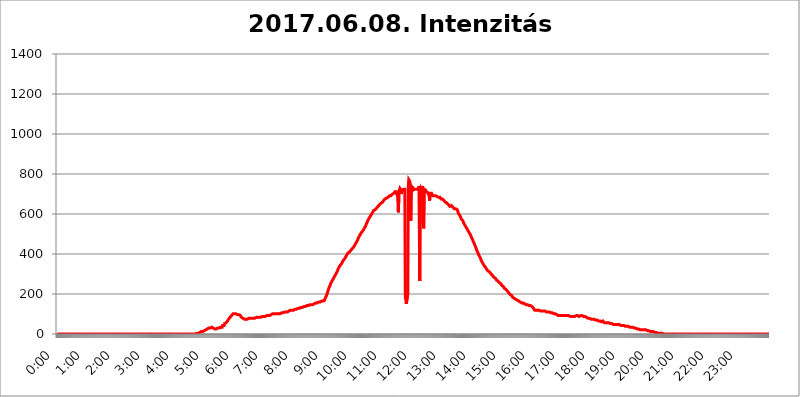
| Category | 2017.06.08. Intenzitás [W/m^2] |
|---|---|
| 0.0 | 0 |
| 0.0006944444444444445 | 0 |
| 0.001388888888888889 | 0 |
| 0.0020833333333333333 | 0 |
| 0.002777777777777778 | 0 |
| 0.003472222222222222 | 0 |
| 0.004166666666666667 | 0 |
| 0.004861111111111111 | 0 |
| 0.005555555555555556 | 0 |
| 0.0062499999999999995 | 0 |
| 0.006944444444444444 | 0 |
| 0.007638888888888889 | 0 |
| 0.008333333333333333 | 0 |
| 0.009027777777777779 | 0 |
| 0.009722222222222222 | 0 |
| 0.010416666666666666 | 0 |
| 0.011111111111111112 | 0 |
| 0.011805555555555555 | 0 |
| 0.012499999999999999 | 0 |
| 0.013194444444444444 | 0 |
| 0.013888888888888888 | 0 |
| 0.014583333333333332 | 0 |
| 0.015277777777777777 | 0 |
| 0.015972222222222224 | 0 |
| 0.016666666666666666 | 0 |
| 0.017361111111111112 | 0 |
| 0.018055555555555557 | 0 |
| 0.01875 | 0 |
| 0.019444444444444445 | 0 |
| 0.02013888888888889 | 0 |
| 0.020833333333333332 | 0 |
| 0.02152777777777778 | 0 |
| 0.022222222222222223 | 0 |
| 0.02291666666666667 | 0 |
| 0.02361111111111111 | 0 |
| 0.024305555555555556 | 0 |
| 0.024999999999999998 | 0 |
| 0.025694444444444447 | 0 |
| 0.02638888888888889 | 0 |
| 0.027083333333333334 | 0 |
| 0.027777777777777776 | 0 |
| 0.02847222222222222 | 0 |
| 0.029166666666666664 | 0 |
| 0.029861111111111113 | 0 |
| 0.030555555555555555 | 0 |
| 0.03125 | 0 |
| 0.03194444444444445 | 0 |
| 0.03263888888888889 | 0 |
| 0.03333333333333333 | 0 |
| 0.034027777777777775 | 0 |
| 0.034722222222222224 | 0 |
| 0.035416666666666666 | 0 |
| 0.036111111111111115 | 0 |
| 0.03680555555555556 | 0 |
| 0.0375 | 0 |
| 0.03819444444444444 | 0 |
| 0.03888888888888889 | 0 |
| 0.03958333333333333 | 0 |
| 0.04027777777777778 | 0 |
| 0.04097222222222222 | 0 |
| 0.041666666666666664 | 0 |
| 0.042361111111111106 | 0 |
| 0.04305555555555556 | 0 |
| 0.043750000000000004 | 0 |
| 0.044444444444444446 | 0 |
| 0.04513888888888889 | 0 |
| 0.04583333333333334 | 0 |
| 0.04652777777777778 | 0 |
| 0.04722222222222222 | 0 |
| 0.04791666666666666 | 0 |
| 0.04861111111111111 | 0 |
| 0.049305555555555554 | 0 |
| 0.049999999999999996 | 0 |
| 0.05069444444444445 | 0 |
| 0.051388888888888894 | 0 |
| 0.052083333333333336 | 0 |
| 0.05277777777777778 | 0 |
| 0.05347222222222222 | 0 |
| 0.05416666666666667 | 0 |
| 0.05486111111111111 | 0 |
| 0.05555555555555555 | 0 |
| 0.05625 | 0 |
| 0.05694444444444444 | 0 |
| 0.057638888888888885 | 0 |
| 0.05833333333333333 | 0 |
| 0.05902777777777778 | 0 |
| 0.059722222222222225 | 0 |
| 0.06041666666666667 | 0 |
| 0.061111111111111116 | 0 |
| 0.06180555555555556 | 0 |
| 0.0625 | 0 |
| 0.06319444444444444 | 0 |
| 0.06388888888888888 | 0 |
| 0.06458333333333334 | 0 |
| 0.06527777777777778 | 0 |
| 0.06597222222222222 | 0 |
| 0.06666666666666667 | 0 |
| 0.06736111111111111 | 0 |
| 0.06805555555555555 | 0 |
| 0.06874999999999999 | 0 |
| 0.06944444444444443 | 0 |
| 0.07013888888888889 | 0 |
| 0.07083333333333333 | 0 |
| 0.07152777777777779 | 0 |
| 0.07222222222222223 | 0 |
| 0.07291666666666667 | 0 |
| 0.07361111111111111 | 0 |
| 0.07430555555555556 | 0 |
| 0.075 | 0 |
| 0.07569444444444444 | 0 |
| 0.0763888888888889 | 0 |
| 0.07708333333333334 | 0 |
| 0.07777777777777778 | 0 |
| 0.07847222222222222 | 0 |
| 0.07916666666666666 | 0 |
| 0.0798611111111111 | 0 |
| 0.08055555555555556 | 0 |
| 0.08125 | 0 |
| 0.08194444444444444 | 0 |
| 0.08263888888888889 | 0 |
| 0.08333333333333333 | 0 |
| 0.08402777777777777 | 0 |
| 0.08472222222222221 | 0 |
| 0.08541666666666665 | 0 |
| 0.08611111111111112 | 0 |
| 0.08680555555555557 | 0 |
| 0.08750000000000001 | 0 |
| 0.08819444444444445 | 0 |
| 0.08888888888888889 | 0 |
| 0.08958333333333333 | 0 |
| 0.09027777777777778 | 0 |
| 0.09097222222222222 | 0 |
| 0.09166666666666667 | 0 |
| 0.09236111111111112 | 0 |
| 0.09305555555555556 | 0 |
| 0.09375 | 0 |
| 0.09444444444444444 | 0 |
| 0.09513888888888888 | 0 |
| 0.09583333333333333 | 0 |
| 0.09652777777777777 | 0 |
| 0.09722222222222222 | 0 |
| 0.09791666666666667 | 0 |
| 0.09861111111111111 | 0 |
| 0.09930555555555555 | 0 |
| 0.09999999999999999 | 0 |
| 0.10069444444444443 | 0 |
| 0.1013888888888889 | 0 |
| 0.10208333333333335 | 0 |
| 0.10277777777777779 | 0 |
| 0.10347222222222223 | 0 |
| 0.10416666666666667 | 0 |
| 0.10486111111111111 | 0 |
| 0.10555555555555556 | 0 |
| 0.10625 | 0 |
| 0.10694444444444444 | 0 |
| 0.1076388888888889 | 0 |
| 0.10833333333333334 | 0 |
| 0.10902777777777778 | 0 |
| 0.10972222222222222 | 0 |
| 0.1111111111111111 | 0 |
| 0.11180555555555556 | 0 |
| 0.11180555555555556 | 0 |
| 0.1125 | 0 |
| 0.11319444444444444 | 0 |
| 0.11388888888888889 | 0 |
| 0.11458333333333333 | 0 |
| 0.11527777777777777 | 0 |
| 0.11597222222222221 | 0 |
| 0.11666666666666665 | 0 |
| 0.1173611111111111 | 0 |
| 0.11805555555555557 | 0 |
| 0.11944444444444445 | 0 |
| 0.12013888888888889 | 0 |
| 0.12083333333333333 | 0 |
| 0.12152777777777778 | 0 |
| 0.12222222222222223 | 0 |
| 0.12291666666666667 | 0 |
| 0.12291666666666667 | 0 |
| 0.12361111111111112 | 0 |
| 0.12430555555555556 | 0 |
| 0.125 | 0 |
| 0.12569444444444444 | 0 |
| 0.12638888888888888 | 0 |
| 0.12708333333333333 | 0 |
| 0.16875 | 0 |
| 0.12847222222222224 | 0 |
| 0.12916666666666668 | 0 |
| 0.12986111111111112 | 0 |
| 0.13055555555555556 | 0 |
| 0.13125 | 0 |
| 0.13194444444444445 | 0 |
| 0.1326388888888889 | 0 |
| 0.13333333333333333 | 0 |
| 0.13402777777777777 | 0 |
| 0.13402777777777777 | 0 |
| 0.13472222222222222 | 0 |
| 0.13541666666666666 | 0 |
| 0.1361111111111111 | 0 |
| 0.13749999999999998 | 0 |
| 0.13819444444444443 | 0 |
| 0.1388888888888889 | 0 |
| 0.13958333333333334 | 0 |
| 0.14027777777777778 | 0 |
| 0.14097222222222222 | 0 |
| 0.14166666666666666 | 0 |
| 0.1423611111111111 | 0 |
| 0.14305555555555557 | 0 |
| 0.14375000000000002 | 0 |
| 0.14444444444444446 | 0 |
| 0.1451388888888889 | 0 |
| 0.1451388888888889 | 0 |
| 0.14652777777777778 | 0 |
| 0.14722222222222223 | 0 |
| 0.14791666666666667 | 0 |
| 0.1486111111111111 | 0 |
| 0.14930555555555555 | 0 |
| 0.15 | 0 |
| 0.15069444444444444 | 0 |
| 0.15138888888888888 | 0 |
| 0.15208333333333332 | 0 |
| 0.15277777777777776 | 0 |
| 0.15347222222222223 | 0 |
| 0.15416666666666667 | 0 |
| 0.15486111111111112 | 0 |
| 0.15555555555555556 | 0 |
| 0.15625 | 0 |
| 0.15694444444444444 | 0 |
| 0.15763888888888888 | 0 |
| 0.15833333333333333 | 0 |
| 0.15902777777777777 | 0 |
| 0.15972222222222224 | 0 |
| 0.16041666666666668 | 0 |
| 0.16111111111111112 | 0 |
| 0.16180555555555556 | 0 |
| 0.1625 | 0 |
| 0.16319444444444445 | 0 |
| 0.1638888888888889 | 0 |
| 0.16458333333333333 | 0 |
| 0.16527777777777777 | 0 |
| 0.16597222222222222 | 0 |
| 0.16666666666666666 | 0 |
| 0.1673611111111111 | 0 |
| 0.16805555555555554 | 0 |
| 0.16874999999999998 | 0 |
| 0.16944444444444443 | 0 |
| 0.17013888888888887 | 0 |
| 0.1708333333333333 | 0 |
| 0.17152777777777775 | 0 |
| 0.17222222222222225 | 0 |
| 0.1729166666666667 | 0 |
| 0.17361111111111113 | 0 |
| 0.17430555555555557 | 0 |
| 0.17500000000000002 | 0 |
| 0.17569444444444446 | 0 |
| 0.1763888888888889 | 0 |
| 0.17708333333333334 | 0 |
| 0.17777777777777778 | 0 |
| 0.17847222222222223 | 0 |
| 0.17916666666666667 | 0 |
| 0.1798611111111111 | 0 |
| 0.18055555555555555 | 0 |
| 0.18125 | 0 |
| 0.18194444444444444 | 0 |
| 0.1826388888888889 | 0 |
| 0.18333333333333335 | 0 |
| 0.1840277777777778 | 0 |
| 0.18472222222222223 | 0 |
| 0.18541666666666667 | 0 |
| 0.18611111111111112 | 0 |
| 0.18680555555555556 | 0 |
| 0.1875 | 0 |
| 0.18819444444444444 | 0 |
| 0.18888888888888888 | 0 |
| 0.18958333333333333 | 0 |
| 0.19027777777777777 | 0 |
| 0.1909722222222222 | 0 |
| 0.19166666666666665 | 0 |
| 0.19236111111111112 | 0 |
| 0.19305555555555554 | 0 |
| 0.19375 | 0 |
| 0.19444444444444445 | 3.525 |
| 0.1951388888888889 | 3.525 |
| 0.19583333333333333 | 3.525 |
| 0.19652777777777777 | 3.525 |
| 0.19722222222222222 | 3.525 |
| 0.19791666666666666 | 3.525 |
| 0.1986111111111111 | 7.887 |
| 0.19930555555555554 | 7.887 |
| 0.19999999999999998 | 7.887 |
| 0.20069444444444443 | 12.257 |
| 0.20138888888888887 | 12.257 |
| 0.2020833333333333 | 12.257 |
| 0.2027777777777778 | 12.257 |
| 0.2034722222222222 | 12.257 |
| 0.2041666666666667 | 12.257 |
| 0.20486111111111113 | 12.257 |
| 0.20555555555555557 | 12.257 |
| 0.20625000000000002 | 16.636 |
| 0.20694444444444446 | 16.636 |
| 0.2076388888888889 | 16.636 |
| 0.20833333333333334 | 21.024 |
| 0.20902777777777778 | 21.024 |
| 0.20972222222222223 | 25.419 |
| 0.21041666666666667 | 25.419 |
| 0.2111111111111111 | 25.419 |
| 0.21180555555555555 | 29.823 |
| 0.2125 | 29.823 |
| 0.21319444444444444 | 29.823 |
| 0.2138888888888889 | 29.823 |
| 0.21458333333333335 | 29.823 |
| 0.2152777777777778 | 29.823 |
| 0.21597222222222223 | 29.823 |
| 0.21666666666666667 | 34.234 |
| 0.21736111111111112 | 34.234 |
| 0.21805555555555556 | 34.234 |
| 0.21875 | 29.823 |
| 0.21944444444444444 | 29.823 |
| 0.22013888888888888 | 25.419 |
| 0.22083333333333333 | 25.419 |
| 0.22152777777777777 | 25.419 |
| 0.2222222222222222 | 25.419 |
| 0.22291666666666665 | 25.419 |
| 0.2236111111111111 | 25.419 |
| 0.22430555555555556 | 29.823 |
| 0.225 | 29.823 |
| 0.22569444444444445 | 29.823 |
| 0.2263888888888889 | 29.823 |
| 0.22708333333333333 | 29.823 |
| 0.22777777777777777 | 29.823 |
| 0.22847222222222222 | 29.823 |
| 0.22916666666666666 | 34.234 |
| 0.2298611111111111 | 38.653 |
| 0.23055555555555554 | 34.234 |
| 0.23124999999999998 | 34.234 |
| 0.23194444444444443 | 43.079 |
| 0.23263888888888887 | 47.511 |
| 0.2333333333333333 | 47.511 |
| 0.2340277777777778 | 43.079 |
| 0.2347222222222222 | 51.951 |
| 0.2354166666666667 | 56.398 |
| 0.23611111111111113 | 56.398 |
| 0.23680555555555557 | 56.398 |
| 0.23750000000000002 | 60.85 |
| 0.23819444444444446 | 60.85 |
| 0.2388888888888889 | 65.31 |
| 0.23958333333333334 | 69.775 |
| 0.24027777777777778 | 74.246 |
| 0.24097222222222223 | 74.246 |
| 0.24166666666666667 | 78.722 |
| 0.2423611111111111 | 83.205 |
| 0.24305555555555555 | 83.205 |
| 0.24375 | 87.692 |
| 0.24444444444444446 | 92.184 |
| 0.24513888888888888 | 92.184 |
| 0.24583333333333335 | 96.682 |
| 0.2465277777777778 | 101.184 |
| 0.24722222222222223 | 101.184 |
| 0.24791666666666667 | 101.184 |
| 0.24861111111111112 | 101.184 |
| 0.24930555555555556 | 101.184 |
| 0.25 | 105.69 |
| 0.25069444444444444 | 101.184 |
| 0.2513888888888889 | 101.184 |
| 0.2520833333333333 | 101.184 |
| 0.25277777777777777 | 96.682 |
| 0.2534722222222222 | 96.682 |
| 0.25416666666666665 | 96.682 |
| 0.2548611111111111 | 96.682 |
| 0.2555555555555556 | 96.682 |
| 0.25625000000000003 | 92.184 |
| 0.2569444444444445 | 92.184 |
| 0.2576388888888889 | 87.692 |
| 0.25833333333333336 | 83.205 |
| 0.2590277777777778 | 83.205 |
| 0.25972222222222224 | 83.205 |
| 0.2604166666666667 | 78.722 |
| 0.2611111111111111 | 78.722 |
| 0.26180555555555557 | 74.246 |
| 0.2625 | 74.246 |
| 0.26319444444444445 | 74.246 |
| 0.2638888888888889 | 74.246 |
| 0.26458333333333334 | 74.246 |
| 0.2652777777777778 | 74.246 |
| 0.2659722222222222 | 74.246 |
| 0.26666666666666666 | 74.246 |
| 0.2673611111111111 | 74.246 |
| 0.26805555555555555 | 74.246 |
| 0.26875 | 78.722 |
| 0.26944444444444443 | 74.246 |
| 0.2701388888888889 | 74.246 |
| 0.2708333333333333 | 78.722 |
| 0.27152777777777776 | 78.722 |
| 0.2722222222222222 | 78.722 |
| 0.27291666666666664 | 78.722 |
| 0.2736111111111111 | 78.722 |
| 0.2743055555555555 | 78.722 |
| 0.27499999999999997 | 78.722 |
| 0.27569444444444446 | 78.722 |
| 0.27638888888888885 | 83.205 |
| 0.27708333333333335 | 78.722 |
| 0.2777777777777778 | 83.205 |
| 0.27847222222222223 | 83.205 |
| 0.2791666666666667 | 83.205 |
| 0.2798611111111111 | 83.205 |
| 0.28055555555555556 | 83.205 |
| 0.28125 | 83.205 |
| 0.28194444444444444 | 83.205 |
| 0.2826388888888889 | 83.205 |
| 0.2833333333333333 | 83.205 |
| 0.28402777777777777 | 83.205 |
| 0.2847222222222222 | 83.205 |
| 0.28541666666666665 | 83.205 |
| 0.28611111111111115 | 87.692 |
| 0.28680555555555554 | 87.692 |
| 0.28750000000000003 | 87.692 |
| 0.2881944444444445 | 87.692 |
| 0.2888888888888889 | 87.692 |
| 0.28958333333333336 | 87.692 |
| 0.2902777777777778 | 87.692 |
| 0.29097222222222224 | 87.692 |
| 0.2916666666666667 | 87.692 |
| 0.2923611111111111 | 92.184 |
| 0.29305555555555557 | 92.184 |
| 0.29375 | 92.184 |
| 0.29444444444444445 | 92.184 |
| 0.2951388888888889 | 92.184 |
| 0.29583333333333334 | 92.184 |
| 0.2965277777777778 | 92.184 |
| 0.2972222222222222 | 92.184 |
| 0.29791666666666666 | 92.184 |
| 0.2986111111111111 | 96.682 |
| 0.29930555555555555 | 96.682 |
| 0.3 | 96.682 |
| 0.30069444444444443 | 96.682 |
| 0.3013888888888889 | 96.682 |
| 0.3020833333333333 | 101.184 |
| 0.30277777777777776 | 101.184 |
| 0.3034722222222222 | 101.184 |
| 0.30416666666666664 | 101.184 |
| 0.3048611111111111 | 101.184 |
| 0.3055555555555555 | 101.184 |
| 0.30624999999999997 | 101.184 |
| 0.3069444444444444 | 101.184 |
| 0.3076388888888889 | 101.184 |
| 0.30833333333333335 | 101.184 |
| 0.3090277777777778 | 101.184 |
| 0.30972222222222223 | 101.184 |
| 0.3104166666666667 | 101.184 |
| 0.3111111111111111 | 101.184 |
| 0.31180555555555556 | 101.184 |
| 0.3125 | 101.184 |
| 0.31319444444444444 | 105.69 |
| 0.3138888888888889 | 101.184 |
| 0.3145833333333333 | 105.69 |
| 0.31527777777777777 | 105.69 |
| 0.3159722222222222 | 105.69 |
| 0.31666666666666665 | 105.69 |
| 0.31736111111111115 | 110.201 |
| 0.31805555555555554 | 105.69 |
| 0.31875000000000003 | 110.201 |
| 0.3194444444444445 | 110.201 |
| 0.3201388888888889 | 110.201 |
| 0.32083333333333336 | 110.201 |
| 0.3215277777777778 | 110.201 |
| 0.32222222222222224 | 110.201 |
| 0.3229166666666667 | 110.201 |
| 0.3236111111111111 | 114.716 |
| 0.32430555555555557 | 114.716 |
| 0.325 | 114.716 |
| 0.32569444444444445 | 114.716 |
| 0.3263888888888889 | 114.716 |
| 0.32708333333333334 | 119.235 |
| 0.3277777777777778 | 114.716 |
| 0.3284722222222222 | 119.235 |
| 0.32916666666666666 | 119.235 |
| 0.3298611111111111 | 119.235 |
| 0.33055555555555555 | 119.235 |
| 0.33125 | 119.235 |
| 0.33194444444444443 | 119.235 |
| 0.3326388888888889 | 119.235 |
| 0.3333333333333333 | 123.758 |
| 0.3340277777777778 | 123.758 |
| 0.3347222222222222 | 123.758 |
| 0.3354166666666667 | 123.758 |
| 0.3361111111111111 | 128.284 |
| 0.3368055555555556 | 128.284 |
| 0.33749999999999997 | 128.284 |
| 0.33819444444444446 | 128.284 |
| 0.33888888888888885 | 128.284 |
| 0.33958333333333335 | 128.284 |
| 0.34027777777777773 | 128.284 |
| 0.34097222222222223 | 132.814 |
| 0.3416666666666666 | 132.814 |
| 0.3423611111111111 | 132.814 |
| 0.3430555555555555 | 132.814 |
| 0.34375 | 132.814 |
| 0.3444444444444445 | 137.347 |
| 0.3451388888888889 | 137.347 |
| 0.3458333333333334 | 137.347 |
| 0.34652777777777777 | 137.347 |
| 0.34722222222222227 | 137.347 |
| 0.34791666666666665 | 137.347 |
| 0.34861111111111115 | 137.347 |
| 0.34930555555555554 | 137.347 |
| 0.35000000000000003 | 141.884 |
| 0.3506944444444444 | 141.884 |
| 0.3513888888888889 | 141.884 |
| 0.3520833333333333 | 141.884 |
| 0.3527777777777778 | 141.884 |
| 0.3534722222222222 | 146.423 |
| 0.3541666666666667 | 146.423 |
| 0.3548611111111111 | 146.423 |
| 0.35555555555555557 | 146.423 |
| 0.35625 | 146.423 |
| 0.35694444444444445 | 146.423 |
| 0.3576388888888889 | 146.423 |
| 0.35833333333333334 | 146.423 |
| 0.3590277777777778 | 150.964 |
| 0.3597222222222222 | 150.964 |
| 0.36041666666666666 | 150.964 |
| 0.3611111111111111 | 150.964 |
| 0.36180555555555555 | 150.964 |
| 0.3625 | 155.509 |
| 0.36319444444444443 | 155.509 |
| 0.3638888888888889 | 155.509 |
| 0.3645833333333333 | 155.509 |
| 0.3652777777777778 | 155.509 |
| 0.3659722222222222 | 160.056 |
| 0.3666666666666667 | 160.056 |
| 0.3673611111111111 | 160.056 |
| 0.3680555555555556 | 160.056 |
| 0.36874999999999997 | 160.056 |
| 0.36944444444444446 | 164.605 |
| 0.37013888888888885 | 164.605 |
| 0.37083333333333335 | 164.605 |
| 0.37152777777777773 | 164.605 |
| 0.37222222222222223 | 164.605 |
| 0.3729166666666666 | 164.605 |
| 0.3736111111111111 | 164.605 |
| 0.3743055555555555 | 164.605 |
| 0.375 | 169.156 |
| 0.3756944444444445 | 178.264 |
| 0.3763888888888889 | 182.82 |
| 0.3770833333333334 | 187.378 |
| 0.37777777777777777 | 191.937 |
| 0.37847222222222227 | 201.058 |
| 0.37916666666666665 | 210.182 |
| 0.37986111111111115 | 214.746 |
| 0.38055555555555554 | 223.873 |
| 0.38125000000000003 | 233 |
| 0.3819444444444444 | 237.564 |
| 0.3826388888888889 | 242.127 |
| 0.3833333333333333 | 251.251 |
| 0.3840277777777778 | 255.813 |
| 0.3847222222222222 | 260.373 |
| 0.3854166666666667 | 264.932 |
| 0.3861111111111111 | 269.49 |
| 0.38680555555555557 | 274.047 |
| 0.3875 | 278.603 |
| 0.38819444444444445 | 283.156 |
| 0.3888888888888889 | 287.709 |
| 0.38958333333333334 | 292.259 |
| 0.3902777777777778 | 296.808 |
| 0.3909722222222222 | 296.808 |
| 0.39166666666666666 | 305.898 |
| 0.3923611111111111 | 310.44 |
| 0.39305555555555555 | 314.98 |
| 0.39375 | 324.052 |
| 0.39444444444444443 | 328.584 |
| 0.3951388888888889 | 333.113 |
| 0.3958333333333333 | 337.639 |
| 0.3965277777777778 | 342.162 |
| 0.3972222222222222 | 346.682 |
| 0.3979166666666667 | 346.682 |
| 0.3986111111111111 | 351.198 |
| 0.3993055555555556 | 355.712 |
| 0.39999999999999997 | 360.221 |
| 0.40069444444444446 | 360.221 |
| 0.40138888888888885 | 369.23 |
| 0.40208333333333335 | 369.23 |
| 0.40277777777777773 | 373.729 |
| 0.40347222222222223 | 378.224 |
| 0.4041666666666666 | 382.715 |
| 0.4048611111111111 | 387.202 |
| 0.4055555555555555 | 391.685 |
| 0.40625 | 396.164 |
| 0.4069444444444445 | 400.638 |
| 0.4076388888888889 | 405.108 |
| 0.4083333333333334 | 405.108 |
| 0.40902777777777777 | 409.574 |
| 0.40972222222222227 | 409.574 |
| 0.41041666666666665 | 414.035 |
| 0.41111111111111115 | 414.035 |
| 0.41180555555555554 | 418.492 |
| 0.41250000000000003 | 418.492 |
| 0.4131944444444444 | 422.943 |
| 0.4138888888888889 | 427.39 |
| 0.4145833333333333 | 427.39 |
| 0.4152777777777778 | 431.833 |
| 0.4159722222222222 | 436.27 |
| 0.4166666666666667 | 440.702 |
| 0.4173611111111111 | 445.129 |
| 0.41805555555555557 | 449.551 |
| 0.41875 | 453.968 |
| 0.41944444444444445 | 458.38 |
| 0.4201388888888889 | 462.786 |
| 0.42083333333333334 | 467.187 |
| 0.4215277777777778 | 471.582 |
| 0.4222222222222222 | 480.356 |
| 0.42291666666666666 | 484.735 |
| 0.4236111111111111 | 489.108 |
| 0.42430555555555555 | 493.475 |
| 0.425 | 497.836 |
| 0.42569444444444443 | 502.192 |
| 0.4263888888888889 | 506.542 |
| 0.4270833333333333 | 510.885 |
| 0.4277777777777778 | 510.885 |
| 0.4284722222222222 | 515.223 |
| 0.4291666666666667 | 515.223 |
| 0.4298611111111111 | 523.88 |
| 0.4305555555555556 | 528.2 |
| 0.43124999999999997 | 532.513 |
| 0.43194444444444446 | 536.82 |
| 0.43263888888888885 | 541.121 |
| 0.43333333333333335 | 549.704 |
| 0.43402777777777773 | 553.986 |
| 0.43472222222222223 | 558.261 |
| 0.4354166666666666 | 566.793 |
| 0.4361111111111111 | 571.049 |
| 0.4368055555555555 | 575.299 |
| 0.4375 | 579.542 |
| 0.4381944444444445 | 583.779 |
| 0.4388888888888889 | 588.009 |
| 0.4395833333333334 | 592.233 |
| 0.44027777777777777 | 596.45 |
| 0.44097222222222227 | 600.661 |
| 0.44166666666666665 | 604.864 |
| 0.44236111111111115 | 609.062 |
| 0.44305555555555554 | 613.252 |
| 0.44375000000000003 | 617.436 |
| 0.4444444444444444 | 617.436 |
| 0.4451388888888889 | 621.613 |
| 0.4458333333333333 | 621.613 |
| 0.4465277777777778 | 625.784 |
| 0.4472222222222222 | 625.784 |
| 0.4479166666666667 | 629.948 |
| 0.4486111111111111 | 634.105 |
| 0.44930555555555557 | 634.105 |
| 0.45 | 638.256 |
| 0.45069444444444445 | 638.256 |
| 0.4513888888888889 | 642.4 |
| 0.45208333333333334 | 646.537 |
| 0.4527777777777778 | 650.667 |
| 0.4534722222222222 | 650.667 |
| 0.45416666666666666 | 654.791 |
| 0.4548611111111111 | 658.909 |
| 0.45555555555555555 | 658.909 |
| 0.45625 | 658.909 |
| 0.45694444444444443 | 663.019 |
| 0.4576388888888889 | 667.123 |
| 0.4583333333333333 | 667.123 |
| 0.4590277777777778 | 671.22 |
| 0.4597222222222222 | 675.311 |
| 0.4604166666666667 | 675.311 |
| 0.4611111111111111 | 675.311 |
| 0.4618055555555556 | 679.395 |
| 0.46249999999999997 | 679.395 |
| 0.46319444444444446 | 679.395 |
| 0.46388888888888885 | 683.473 |
| 0.46458333333333335 | 683.473 |
| 0.46527777777777773 | 687.544 |
| 0.46597222222222223 | 691.608 |
| 0.4666666666666666 | 691.608 |
| 0.4673611111111111 | 691.608 |
| 0.4680555555555555 | 691.608 |
| 0.46875 | 695.666 |
| 0.4694444444444445 | 695.666 |
| 0.4701388888888889 | 699.717 |
| 0.4708333333333334 | 703.762 |
| 0.47152777777777777 | 703.762 |
| 0.47222222222222227 | 703.762 |
| 0.47291666666666665 | 707.8 |
| 0.47361111111111115 | 711.832 |
| 0.47430555555555554 | 711.832 |
| 0.47500000000000003 | 711.832 |
| 0.4756944444444444 | 711.832 |
| 0.4763888888888889 | 707.8 |
| 0.4770833333333333 | 687.544 |
| 0.4777777777777778 | 703.762 |
| 0.4784722222222222 | 609.062 |
| 0.4791666666666667 | 703.762 |
| 0.4798611111111111 | 719.877 |
| 0.48055555555555557 | 727.896 |
| 0.48125 | 723.889 |
| 0.48194444444444445 | 719.877 |
| 0.4826388888888889 | 699.717 |
| 0.48333333333333334 | 719.877 |
| 0.4840277777777778 | 719.877 |
| 0.4847222222222222 | 719.877 |
| 0.48541666666666666 | 723.889 |
| 0.4861111111111111 | 723.889 |
| 0.48680555555555555 | 723.889 |
| 0.4875 | 723.889 |
| 0.48819444444444443 | 178.264 |
| 0.4888888888888889 | 196.497 |
| 0.4895833333333333 | 150.964 |
| 0.4902777777777778 | 150.964 |
| 0.4909722222222222 | 155.509 |
| 0.4916666666666667 | 205.62 |
| 0.4923611111111111 | 739.877 |
| 0.4930555555555556 | 771.559 |
| 0.49374999999999997 | 767.62 |
| 0.49444444444444446 | 763.674 |
| 0.49513888888888885 | 747.834 |
| 0.49583333333333335 | 566.793 |
| 0.49652777777777773 | 739.877 |
| 0.49722222222222223 | 743.859 |
| 0.4979166666666666 | 739.877 |
| 0.4986111111111111 | 731.896 |
| 0.4993055555555555 | 719.877 |
| 0.5 | 719.877 |
| 0.5006944444444444 | 719.877 |
| 0.5013888888888889 | 723.889 |
| 0.5020833333333333 | 723.889 |
| 0.5027777777777778 | 723.889 |
| 0.5034722222222222 | 723.889 |
| 0.5041666666666667 | 719.877 |
| 0.5048611111111111 | 719.877 |
| 0.5055555555555555 | 723.889 |
| 0.50625 | 727.896 |
| 0.5069444444444444 | 731.896 |
| 0.5076388888888889 | 739.877 |
| 0.5083333333333333 | 264.932 |
| 0.5090277777777777 | 719.877 |
| 0.5097222222222222 | 727.896 |
| 0.5104166666666666 | 719.877 |
| 0.5111111111111112 | 719.877 |
| 0.5118055555555555 | 731.896 |
| 0.5125000000000001 | 739.877 |
| 0.5131944444444444 | 553.986 |
| 0.513888888888889 | 528.2 |
| 0.5145833333333333 | 723.889 |
| 0.5152777777777778 | 727.896 |
| 0.5159722222222222 | 723.889 |
| 0.5166666666666667 | 719.877 |
| 0.517361111111111 | 711.832 |
| 0.5180555555555556 | 711.832 |
| 0.5187499999999999 | 707.8 |
| 0.5194444444444445 | 707.8 |
| 0.5201388888888888 | 703.762 |
| 0.5208333333333334 | 703.762 |
| 0.5215277777777778 | 691.608 |
| 0.5222222222222223 | 667.123 |
| 0.5229166666666667 | 703.762 |
| 0.5236111111111111 | 703.762 |
| 0.5243055555555556 | 703.762 |
| 0.525 | 703.762 |
| 0.5256944444444445 | 703.762 |
| 0.5263888888888889 | 691.608 |
| 0.5270833333333333 | 691.608 |
| 0.5277777777777778 | 691.608 |
| 0.5284722222222222 | 691.608 |
| 0.5291666666666667 | 687.544 |
| 0.5298611111111111 | 687.544 |
| 0.5305555555555556 | 691.608 |
| 0.53125 | 691.608 |
| 0.5319444444444444 | 687.544 |
| 0.5326388888888889 | 687.544 |
| 0.5333333333333333 | 687.544 |
| 0.5340277777777778 | 687.544 |
| 0.5347222222222222 | 683.473 |
| 0.5354166666666667 | 683.473 |
| 0.5361111111111111 | 683.473 |
| 0.5368055555555555 | 683.473 |
| 0.5375 | 679.395 |
| 0.5381944444444444 | 675.311 |
| 0.5388888888888889 | 675.311 |
| 0.5395833333333333 | 675.311 |
| 0.5402777777777777 | 675.311 |
| 0.5409722222222222 | 671.22 |
| 0.5416666666666666 | 671.22 |
| 0.5423611111111112 | 667.123 |
| 0.5430555555555555 | 667.123 |
| 0.5437500000000001 | 667.123 |
| 0.5444444444444444 | 658.909 |
| 0.545138888888889 | 658.909 |
| 0.5458333333333333 | 654.791 |
| 0.5465277777777778 | 654.791 |
| 0.5472222222222222 | 650.667 |
| 0.5479166666666667 | 650.667 |
| 0.548611111111111 | 646.537 |
| 0.5493055555555556 | 642.4 |
| 0.5499999999999999 | 642.4 |
| 0.5506944444444445 | 638.256 |
| 0.5513888888888888 | 638.256 |
| 0.5520833333333334 | 642.4 |
| 0.5527777777777778 | 642.4 |
| 0.5534722222222223 | 642.4 |
| 0.5541666666666667 | 638.256 |
| 0.5548611111111111 | 634.105 |
| 0.5555555555555556 | 634.105 |
| 0.55625 | 629.948 |
| 0.5569444444444445 | 625.784 |
| 0.5576388888888889 | 625.784 |
| 0.5583333333333333 | 625.784 |
| 0.5590277777777778 | 625.784 |
| 0.5597222222222222 | 625.784 |
| 0.5604166666666667 | 625.784 |
| 0.5611111111111111 | 621.613 |
| 0.5618055555555556 | 617.436 |
| 0.5625 | 604.864 |
| 0.5631944444444444 | 600.661 |
| 0.5638888888888889 | 596.45 |
| 0.5645833333333333 | 592.233 |
| 0.5652777777777778 | 588.009 |
| 0.5659722222222222 | 583.779 |
| 0.5666666666666667 | 575.299 |
| 0.5673611111111111 | 575.299 |
| 0.5680555555555555 | 571.049 |
| 0.56875 | 566.793 |
| 0.5694444444444444 | 562.53 |
| 0.5701388888888889 | 553.986 |
| 0.5708333333333333 | 549.704 |
| 0.5715277777777777 | 549.704 |
| 0.5722222222222222 | 541.121 |
| 0.5729166666666666 | 536.82 |
| 0.5736111111111112 | 532.513 |
| 0.5743055555555555 | 532.513 |
| 0.5750000000000001 | 523.88 |
| 0.5756944444444444 | 519.555 |
| 0.576388888888889 | 519.555 |
| 0.5770833333333333 | 510.885 |
| 0.5777777777777778 | 506.542 |
| 0.5784722222222222 | 502.192 |
| 0.5791666666666667 | 497.836 |
| 0.579861111111111 | 493.475 |
| 0.5805555555555556 | 489.108 |
| 0.5812499999999999 | 480.356 |
| 0.5819444444444445 | 475.972 |
| 0.5826388888888888 | 471.582 |
| 0.5833333333333334 | 462.786 |
| 0.5840277777777778 | 458.38 |
| 0.5847222222222223 | 453.968 |
| 0.5854166666666667 | 445.129 |
| 0.5861111111111111 | 440.702 |
| 0.5868055555555556 | 436.27 |
| 0.5875 | 427.39 |
| 0.5881944444444445 | 422.943 |
| 0.5888888888888889 | 414.035 |
| 0.5895833333333333 | 409.574 |
| 0.5902777777777778 | 405.108 |
| 0.5909722222222222 | 396.164 |
| 0.5916666666666667 | 391.685 |
| 0.5923611111111111 | 387.202 |
| 0.5930555555555556 | 382.715 |
| 0.59375 | 378.224 |
| 0.5944444444444444 | 369.23 |
| 0.5951388888888889 | 364.728 |
| 0.5958333333333333 | 360.221 |
| 0.5965277777777778 | 355.712 |
| 0.5972222222222222 | 351.198 |
| 0.5979166666666667 | 351.198 |
| 0.5986111111111111 | 342.162 |
| 0.5993055555555555 | 342.162 |
| 0.6 | 337.639 |
| 0.6006944444444444 | 333.113 |
| 0.6013888888888889 | 328.584 |
| 0.6020833333333333 | 324.052 |
| 0.6027777777777777 | 319.517 |
| 0.6034722222222222 | 319.517 |
| 0.6041666666666666 | 314.98 |
| 0.6048611111111112 | 314.98 |
| 0.6055555555555555 | 310.44 |
| 0.6062500000000001 | 310.44 |
| 0.6069444444444444 | 305.898 |
| 0.607638888888889 | 305.898 |
| 0.6083333333333333 | 301.354 |
| 0.6090277777777778 | 301.354 |
| 0.6097222222222222 | 296.808 |
| 0.6104166666666667 | 292.259 |
| 0.611111111111111 | 292.259 |
| 0.6118055555555556 | 287.709 |
| 0.6124999999999999 | 283.156 |
| 0.6131944444444445 | 283.156 |
| 0.6138888888888888 | 278.603 |
| 0.6145833333333334 | 278.603 |
| 0.6152777777777778 | 274.047 |
| 0.6159722222222223 | 269.49 |
| 0.6166666666666667 | 269.49 |
| 0.6173611111111111 | 264.932 |
| 0.6180555555555556 | 264.932 |
| 0.61875 | 260.373 |
| 0.6194444444444445 | 260.373 |
| 0.6201388888888889 | 255.813 |
| 0.6208333333333333 | 255.813 |
| 0.6215277777777778 | 251.251 |
| 0.6222222222222222 | 251.251 |
| 0.6229166666666667 | 246.689 |
| 0.6236111111111111 | 242.127 |
| 0.6243055555555556 | 242.127 |
| 0.625 | 237.564 |
| 0.6256944444444444 | 237.564 |
| 0.6263888888888889 | 233 |
| 0.6270833333333333 | 228.436 |
| 0.6277777777777778 | 228.436 |
| 0.6284722222222222 | 223.873 |
| 0.6291666666666667 | 223.873 |
| 0.6298611111111111 | 219.309 |
| 0.6305555555555555 | 219.309 |
| 0.63125 | 214.746 |
| 0.6319444444444444 | 210.182 |
| 0.6326388888888889 | 210.182 |
| 0.6333333333333333 | 205.62 |
| 0.6340277777777777 | 201.058 |
| 0.6347222222222222 | 201.058 |
| 0.6354166666666666 | 196.497 |
| 0.6361111111111112 | 196.497 |
| 0.6368055555555555 | 191.937 |
| 0.6375000000000001 | 191.937 |
| 0.6381944444444444 | 187.378 |
| 0.638888888888889 | 182.82 |
| 0.6395833333333333 | 182.82 |
| 0.6402777777777778 | 178.264 |
| 0.6409722222222222 | 178.264 |
| 0.6416666666666667 | 173.709 |
| 0.642361111111111 | 173.709 |
| 0.6430555555555556 | 173.709 |
| 0.6437499999999999 | 173.709 |
| 0.6444444444444445 | 169.156 |
| 0.6451388888888888 | 169.156 |
| 0.6458333333333334 | 164.605 |
| 0.6465277777777778 | 164.605 |
| 0.6472222222222223 | 164.605 |
| 0.6479166666666667 | 160.056 |
| 0.6486111111111111 | 160.056 |
| 0.6493055555555556 | 160.056 |
| 0.65 | 160.056 |
| 0.6506944444444445 | 160.056 |
| 0.6513888888888889 | 155.509 |
| 0.6520833333333333 | 155.509 |
| 0.6527777777777778 | 155.509 |
| 0.6534722222222222 | 155.509 |
| 0.6541666666666667 | 155.509 |
| 0.6548611111111111 | 155.509 |
| 0.6555555555555556 | 150.964 |
| 0.65625 | 150.964 |
| 0.6569444444444444 | 150.964 |
| 0.6576388888888889 | 146.423 |
| 0.6583333333333333 | 146.423 |
| 0.6590277777777778 | 146.423 |
| 0.6597222222222222 | 146.423 |
| 0.6604166666666667 | 146.423 |
| 0.6611111111111111 | 141.884 |
| 0.6618055555555555 | 141.884 |
| 0.6625 | 141.884 |
| 0.6631944444444444 | 141.884 |
| 0.6638888888888889 | 141.884 |
| 0.6645833333333333 | 141.884 |
| 0.6652777777777777 | 141.884 |
| 0.6659722222222222 | 137.347 |
| 0.6666666666666666 | 137.347 |
| 0.6673611111111111 | 132.814 |
| 0.6680555555555556 | 128.284 |
| 0.6687500000000001 | 123.758 |
| 0.6694444444444444 | 119.235 |
| 0.6701388888888888 | 119.235 |
| 0.6708333333333334 | 119.235 |
| 0.6715277777777778 | 119.235 |
| 0.6722222222222222 | 119.235 |
| 0.6729166666666666 | 119.235 |
| 0.6736111111111112 | 119.235 |
| 0.6743055555555556 | 119.235 |
| 0.6749999999999999 | 119.235 |
| 0.6756944444444444 | 119.235 |
| 0.6763888888888889 | 114.716 |
| 0.6770833333333334 | 114.716 |
| 0.6777777777777777 | 114.716 |
| 0.6784722222222223 | 114.716 |
| 0.6791666666666667 | 114.716 |
| 0.6798611111111111 | 114.716 |
| 0.6805555555555555 | 114.716 |
| 0.68125 | 114.716 |
| 0.6819444444444445 | 114.716 |
| 0.6826388888888889 | 110.201 |
| 0.6833333333333332 | 110.201 |
| 0.6840277777777778 | 114.716 |
| 0.6847222222222222 | 114.716 |
| 0.6854166666666667 | 110.201 |
| 0.686111111111111 | 110.201 |
| 0.6868055555555556 | 110.201 |
| 0.6875 | 110.201 |
| 0.6881944444444444 | 110.201 |
| 0.688888888888889 | 110.201 |
| 0.6895833333333333 | 110.201 |
| 0.6902777777777778 | 110.201 |
| 0.6909722222222222 | 110.201 |
| 0.6916666666666668 | 110.201 |
| 0.6923611111111111 | 105.69 |
| 0.6930555555555555 | 105.69 |
| 0.69375 | 105.69 |
| 0.6944444444444445 | 105.69 |
| 0.6951388888888889 | 105.69 |
| 0.6958333333333333 | 105.69 |
| 0.6965277777777777 | 101.184 |
| 0.6972222222222223 | 101.184 |
| 0.6979166666666666 | 101.184 |
| 0.6986111111111111 | 101.184 |
| 0.6993055555555556 | 101.184 |
| 0.7000000000000001 | 96.682 |
| 0.7006944444444444 | 96.682 |
| 0.7013888888888888 | 96.682 |
| 0.7020833333333334 | 92.184 |
| 0.7027777777777778 | 92.184 |
| 0.7034722222222222 | 92.184 |
| 0.7041666666666666 | 92.184 |
| 0.7048611111111112 | 92.184 |
| 0.7055555555555556 | 92.184 |
| 0.7062499999999999 | 92.184 |
| 0.7069444444444444 | 92.184 |
| 0.7076388888888889 | 92.184 |
| 0.7083333333333334 | 92.184 |
| 0.7090277777777777 | 92.184 |
| 0.7097222222222223 | 92.184 |
| 0.7104166666666667 | 92.184 |
| 0.7111111111111111 | 92.184 |
| 0.7118055555555555 | 92.184 |
| 0.7125 | 92.184 |
| 0.7131944444444445 | 92.184 |
| 0.7138888888888889 | 92.184 |
| 0.7145833333333332 | 92.184 |
| 0.7152777777777778 | 92.184 |
| 0.7159722222222222 | 92.184 |
| 0.7166666666666667 | 92.184 |
| 0.717361111111111 | 92.184 |
| 0.7180555555555556 | 87.692 |
| 0.71875 | 87.692 |
| 0.7194444444444444 | 87.692 |
| 0.720138888888889 | 87.692 |
| 0.7208333333333333 | 87.692 |
| 0.7215277777777778 | 87.692 |
| 0.7222222222222222 | 87.692 |
| 0.7229166666666668 | 87.692 |
| 0.7236111111111111 | 87.692 |
| 0.7243055555555555 | 87.692 |
| 0.725 | 87.692 |
| 0.7256944444444445 | 87.692 |
| 0.7263888888888889 | 92.184 |
| 0.7270833333333333 | 87.692 |
| 0.7277777777777777 | 92.184 |
| 0.7284722222222223 | 92.184 |
| 0.7291666666666666 | 92.184 |
| 0.7298611111111111 | 92.184 |
| 0.7305555555555556 | 92.184 |
| 0.7312500000000001 | 92.184 |
| 0.7319444444444444 | 87.692 |
| 0.7326388888888888 | 87.692 |
| 0.7333333333333334 | 92.184 |
| 0.7340277777777778 | 92.184 |
| 0.7347222222222222 | 92.184 |
| 0.7354166666666666 | 92.184 |
| 0.7361111111111112 | 92.184 |
| 0.7368055555555556 | 92.184 |
| 0.7374999999999999 | 87.692 |
| 0.7381944444444444 | 87.692 |
| 0.7388888888888889 | 87.692 |
| 0.7395833333333334 | 83.205 |
| 0.7402777777777777 | 87.692 |
| 0.7409722222222223 | 87.692 |
| 0.7416666666666667 | 83.205 |
| 0.7423611111111111 | 83.205 |
| 0.7430555555555555 | 83.205 |
| 0.74375 | 83.205 |
| 0.7444444444444445 | 78.722 |
| 0.7451388888888889 | 78.722 |
| 0.7458333333333332 | 78.722 |
| 0.7465277777777778 | 78.722 |
| 0.7472222222222222 | 78.722 |
| 0.7479166666666667 | 78.722 |
| 0.748611111111111 | 74.246 |
| 0.7493055555555556 | 74.246 |
| 0.75 | 74.246 |
| 0.7506944444444444 | 74.246 |
| 0.751388888888889 | 74.246 |
| 0.7520833333333333 | 74.246 |
| 0.7527777777777778 | 74.246 |
| 0.7534722222222222 | 74.246 |
| 0.7541666666666668 | 74.246 |
| 0.7548611111111111 | 69.775 |
| 0.7555555555555555 | 69.775 |
| 0.75625 | 69.775 |
| 0.7569444444444445 | 69.775 |
| 0.7576388888888889 | 69.775 |
| 0.7583333333333333 | 65.31 |
| 0.7590277777777777 | 65.31 |
| 0.7597222222222223 | 65.31 |
| 0.7604166666666666 | 65.31 |
| 0.7611111111111111 | 65.31 |
| 0.7618055555555556 | 65.31 |
| 0.7625000000000001 | 65.31 |
| 0.7631944444444444 | 60.85 |
| 0.7638888888888888 | 65.31 |
| 0.7645833333333334 | 60.85 |
| 0.7652777777777778 | 65.31 |
| 0.7659722222222222 | 65.31 |
| 0.7666666666666666 | 60.85 |
| 0.7673611111111112 | 56.398 |
| 0.7680555555555556 | 56.398 |
| 0.7687499999999999 | 56.398 |
| 0.7694444444444444 | 56.398 |
| 0.7701388888888889 | 56.398 |
| 0.7708333333333334 | 56.398 |
| 0.7715277777777777 | 56.398 |
| 0.7722222222222223 | 56.398 |
| 0.7729166666666667 | 56.398 |
| 0.7736111111111111 | 56.398 |
| 0.7743055555555555 | 56.398 |
| 0.775 | 51.951 |
| 0.7756944444444445 | 51.951 |
| 0.7763888888888889 | 51.951 |
| 0.7770833333333332 | 51.951 |
| 0.7777777777777778 | 51.951 |
| 0.7784722222222222 | 51.951 |
| 0.7791666666666667 | 51.951 |
| 0.779861111111111 | 47.511 |
| 0.7805555555555556 | 47.511 |
| 0.78125 | 47.511 |
| 0.7819444444444444 | 47.511 |
| 0.782638888888889 | 47.511 |
| 0.7833333333333333 | 47.511 |
| 0.7840277777777778 | 47.511 |
| 0.7847222222222222 | 47.511 |
| 0.7854166666666668 | 47.511 |
| 0.7861111111111111 | 47.511 |
| 0.7868055555555555 | 47.511 |
| 0.7875 | 47.511 |
| 0.7881944444444445 | 47.511 |
| 0.7888888888888889 | 43.079 |
| 0.7895833333333333 | 47.511 |
| 0.7902777777777777 | 43.079 |
| 0.7909722222222223 | 43.079 |
| 0.7916666666666666 | 43.079 |
| 0.7923611111111111 | 43.079 |
| 0.7930555555555556 | 43.079 |
| 0.7937500000000001 | 43.079 |
| 0.7944444444444444 | 43.079 |
| 0.7951388888888888 | 38.653 |
| 0.7958333333333334 | 38.653 |
| 0.7965277777777778 | 38.653 |
| 0.7972222222222222 | 38.653 |
| 0.7979166666666666 | 38.653 |
| 0.7986111111111112 | 38.653 |
| 0.7993055555555556 | 38.653 |
| 0.7999999999999999 | 38.653 |
| 0.8006944444444444 | 38.653 |
| 0.8013888888888889 | 34.234 |
| 0.8020833333333334 | 34.234 |
| 0.8027777777777777 | 34.234 |
| 0.8034722222222223 | 34.234 |
| 0.8041666666666667 | 34.234 |
| 0.8048611111111111 | 34.234 |
| 0.8055555555555555 | 34.234 |
| 0.80625 | 34.234 |
| 0.8069444444444445 | 34.234 |
| 0.8076388888888889 | 29.823 |
| 0.8083333333333332 | 29.823 |
| 0.8090277777777778 | 29.823 |
| 0.8097222222222222 | 29.823 |
| 0.8104166666666667 | 29.823 |
| 0.811111111111111 | 29.823 |
| 0.8118055555555556 | 29.823 |
| 0.8125 | 29.823 |
| 0.8131944444444444 | 25.419 |
| 0.813888888888889 | 25.419 |
| 0.8145833333333333 | 25.419 |
| 0.8152777777777778 | 25.419 |
| 0.8159722222222222 | 21.024 |
| 0.8166666666666668 | 21.024 |
| 0.8173611111111111 | 21.024 |
| 0.8180555555555555 | 21.024 |
| 0.81875 | 21.024 |
| 0.8194444444444445 | 21.024 |
| 0.8201388888888889 | 21.024 |
| 0.8208333333333333 | 21.024 |
| 0.8215277777777777 | 21.024 |
| 0.8222222222222223 | 21.024 |
| 0.8229166666666666 | 21.024 |
| 0.8236111111111111 | 21.024 |
| 0.8243055555555556 | 21.024 |
| 0.8250000000000001 | 21.024 |
| 0.8256944444444444 | 21.024 |
| 0.8263888888888888 | 16.636 |
| 0.8270833333333334 | 16.636 |
| 0.8277777777777778 | 16.636 |
| 0.8284722222222222 | 16.636 |
| 0.8291666666666666 | 16.636 |
| 0.8298611111111112 | 16.636 |
| 0.8305555555555556 | 16.636 |
| 0.8312499999999999 | 12.257 |
| 0.8319444444444444 | 12.257 |
| 0.8326388888888889 | 12.257 |
| 0.8333333333333334 | 12.257 |
| 0.8340277777777777 | 12.257 |
| 0.8347222222222223 | 12.257 |
| 0.8354166666666667 | 12.257 |
| 0.8361111111111111 | 12.257 |
| 0.8368055555555555 | 12.257 |
| 0.8375 | 7.887 |
| 0.8381944444444445 | 7.887 |
| 0.8388888888888889 | 7.887 |
| 0.8395833333333332 | 7.887 |
| 0.8402777777777778 | 7.887 |
| 0.8409722222222222 | 7.887 |
| 0.8416666666666667 | 7.887 |
| 0.842361111111111 | 3.525 |
| 0.8430555555555556 | 3.525 |
| 0.84375 | 3.525 |
| 0.8444444444444444 | 3.525 |
| 0.845138888888889 | 3.525 |
| 0.8458333333333333 | 3.525 |
| 0.8465277777777778 | 3.525 |
| 0.8472222222222222 | 3.525 |
| 0.8479166666666668 | 3.525 |
| 0.8486111111111111 | 3.525 |
| 0.8493055555555555 | 0 |
| 0.85 | 0 |
| 0.8506944444444445 | 0 |
| 0.8513888888888889 | 0 |
| 0.8520833333333333 | 0 |
| 0.8527777777777777 | 0 |
| 0.8534722222222223 | 0 |
| 0.8541666666666666 | 0 |
| 0.8548611111111111 | 0 |
| 0.8555555555555556 | 0 |
| 0.8562500000000001 | 0 |
| 0.8569444444444444 | 0 |
| 0.8576388888888888 | 0 |
| 0.8583333333333334 | 0 |
| 0.8590277777777778 | 0 |
| 0.8597222222222222 | 0 |
| 0.8604166666666666 | 0 |
| 0.8611111111111112 | 0 |
| 0.8618055555555556 | 0 |
| 0.8624999999999999 | 0 |
| 0.8631944444444444 | 0 |
| 0.8638888888888889 | 0 |
| 0.8645833333333334 | 0 |
| 0.8652777777777777 | 0 |
| 0.8659722222222223 | 0 |
| 0.8666666666666667 | 0 |
| 0.8673611111111111 | 0 |
| 0.8680555555555555 | 0 |
| 0.86875 | 0 |
| 0.8694444444444445 | 0 |
| 0.8701388888888889 | 0 |
| 0.8708333333333332 | 0 |
| 0.8715277777777778 | 0 |
| 0.8722222222222222 | 0 |
| 0.8729166666666667 | 0 |
| 0.873611111111111 | 0 |
| 0.8743055555555556 | 0 |
| 0.875 | 0 |
| 0.8756944444444444 | 0 |
| 0.876388888888889 | 0 |
| 0.8770833333333333 | 0 |
| 0.8777777777777778 | 0 |
| 0.8784722222222222 | 0 |
| 0.8791666666666668 | 0 |
| 0.8798611111111111 | 0 |
| 0.8805555555555555 | 0 |
| 0.88125 | 0 |
| 0.8819444444444445 | 0 |
| 0.8826388888888889 | 0 |
| 0.8833333333333333 | 0 |
| 0.8840277777777777 | 0 |
| 0.8847222222222223 | 0 |
| 0.8854166666666666 | 0 |
| 0.8861111111111111 | 0 |
| 0.8868055555555556 | 0 |
| 0.8875000000000001 | 0 |
| 0.8881944444444444 | 0 |
| 0.8888888888888888 | 0 |
| 0.8895833333333334 | 0 |
| 0.8902777777777778 | 0 |
| 0.8909722222222222 | 0 |
| 0.8916666666666666 | 0 |
| 0.8923611111111112 | 0 |
| 0.8930555555555556 | 0 |
| 0.8937499999999999 | 0 |
| 0.8944444444444444 | 0 |
| 0.8951388888888889 | 0 |
| 0.8958333333333334 | 0 |
| 0.8965277777777777 | 0 |
| 0.8972222222222223 | 0 |
| 0.8979166666666667 | 0 |
| 0.8986111111111111 | 0 |
| 0.8993055555555555 | 0 |
| 0.9 | 0 |
| 0.9006944444444445 | 0 |
| 0.9013888888888889 | 0 |
| 0.9020833333333332 | 0 |
| 0.9027777777777778 | 0 |
| 0.9034722222222222 | 0 |
| 0.9041666666666667 | 0 |
| 0.904861111111111 | 0 |
| 0.9055555555555556 | 0 |
| 0.90625 | 0 |
| 0.9069444444444444 | 0 |
| 0.907638888888889 | 0 |
| 0.9083333333333333 | 0 |
| 0.9090277777777778 | 0 |
| 0.9097222222222222 | 0 |
| 0.9104166666666668 | 0 |
| 0.9111111111111111 | 0 |
| 0.9118055555555555 | 0 |
| 0.9125 | 0 |
| 0.9131944444444445 | 0 |
| 0.9138888888888889 | 0 |
| 0.9145833333333333 | 0 |
| 0.9152777777777777 | 0 |
| 0.9159722222222223 | 0 |
| 0.9166666666666666 | 0 |
| 0.9173611111111111 | 0 |
| 0.9180555555555556 | 0 |
| 0.9187500000000001 | 0 |
| 0.9194444444444444 | 0 |
| 0.9201388888888888 | 0 |
| 0.9208333333333334 | 0 |
| 0.9215277777777778 | 0 |
| 0.9222222222222222 | 0 |
| 0.9229166666666666 | 0 |
| 0.9236111111111112 | 0 |
| 0.9243055555555556 | 0 |
| 0.9249999999999999 | 0 |
| 0.9256944444444444 | 0 |
| 0.9263888888888889 | 0 |
| 0.9270833333333334 | 0 |
| 0.9277777777777777 | 0 |
| 0.9284722222222223 | 0 |
| 0.9291666666666667 | 0 |
| 0.9298611111111111 | 0 |
| 0.9305555555555555 | 0 |
| 0.93125 | 0 |
| 0.9319444444444445 | 0 |
| 0.9326388888888889 | 0 |
| 0.9333333333333332 | 0 |
| 0.9340277777777778 | 0 |
| 0.9347222222222222 | 0 |
| 0.9354166666666667 | 0 |
| 0.936111111111111 | 0 |
| 0.9368055555555556 | 0 |
| 0.9375 | 0 |
| 0.9381944444444444 | 0 |
| 0.938888888888889 | 0 |
| 0.9395833333333333 | 0 |
| 0.9402777777777778 | 0 |
| 0.9409722222222222 | 0 |
| 0.9416666666666668 | 0 |
| 0.9423611111111111 | 0 |
| 0.9430555555555555 | 0 |
| 0.94375 | 0 |
| 0.9444444444444445 | 0 |
| 0.9451388888888889 | 0 |
| 0.9458333333333333 | 0 |
| 0.9465277777777777 | 0 |
| 0.9472222222222223 | 0 |
| 0.9479166666666666 | 0 |
| 0.9486111111111111 | 0 |
| 0.9493055555555556 | 0 |
| 0.9500000000000001 | 0 |
| 0.9506944444444444 | 0 |
| 0.9513888888888888 | 0 |
| 0.9520833333333334 | 0 |
| 0.9527777777777778 | 0 |
| 0.9534722222222222 | 0 |
| 0.9541666666666666 | 0 |
| 0.9548611111111112 | 0 |
| 0.9555555555555556 | 0 |
| 0.9562499999999999 | 0 |
| 0.9569444444444444 | 0 |
| 0.9576388888888889 | 0 |
| 0.9583333333333334 | 0 |
| 0.9590277777777777 | 0 |
| 0.9597222222222223 | 0 |
| 0.9604166666666667 | 0 |
| 0.9611111111111111 | 0 |
| 0.9618055555555555 | 0 |
| 0.9625 | 0 |
| 0.9631944444444445 | 0 |
| 0.9638888888888889 | 0 |
| 0.9645833333333332 | 0 |
| 0.9652777777777778 | 0 |
| 0.9659722222222222 | 0 |
| 0.9666666666666667 | 0 |
| 0.967361111111111 | 0 |
| 0.9680555555555556 | 0 |
| 0.96875 | 0 |
| 0.9694444444444444 | 0 |
| 0.970138888888889 | 0 |
| 0.9708333333333333 | 0 |
| 0.9715277777777778 | 0 |
| 0.9722222222222222 | 0 |
| 0.9729166666666668 | 0 |
| 0.9736111111111111 | 0 |
| 0.9743055555555555 | 0 |
| 0.975 | 0 |
| 0.9756944444444445 | 0 |
| 0.9763888888888889 | 0 |
| 0.9770833333333333 | 0 |
| 0.9777777777777777 | 0 |
| 0.9784722222222223 | 0 |
| 0.9791666666666666 | 0 |
| 0.9798611111111111 | 0 |
| 0.9805555555555556 | 0 |
| 0.9812500000000001 | 0 |
| 0.9819444444444444 | 0 |
| 0.9826388888888888 | 0 |
| 0.9833333333333334 | 0 |
| 0.9840277777777778 | 0 |
| 0.9847222222222222 | 0 |
| 0.9854166666666666 | 0 |
| 0.9861111111111112 | 0 |
| 0.9868055555555556 | 0 |
| 0.9874999999999999 | 0 |
| 0.9881944444444444 | 0 |
| 0.9888888888888889 | 0 |
| 0.9895833333333334 | 0 |
| 0.9902777777777777 | 0 |
| 0.9909722222222223 | 0 |
| 0.9916666666666667 | 0 |
| 0.9923611111111111 | 0 |
| 0.9930555555555555 | 0 |
| 0.99375 | 0 |
| 0.9944444444444445 | 0 |
| 0.9951388888888889 | 0 |
| 0.9958333333333332 | 0 |
| 0.9965277777777778 | 0 |
| 0.9972222222222222 | 0 |
| 0.9979166666666667 | 0 |
| 0.998611111111111 | 0 |
| 0.9993055555555556 | 0 |